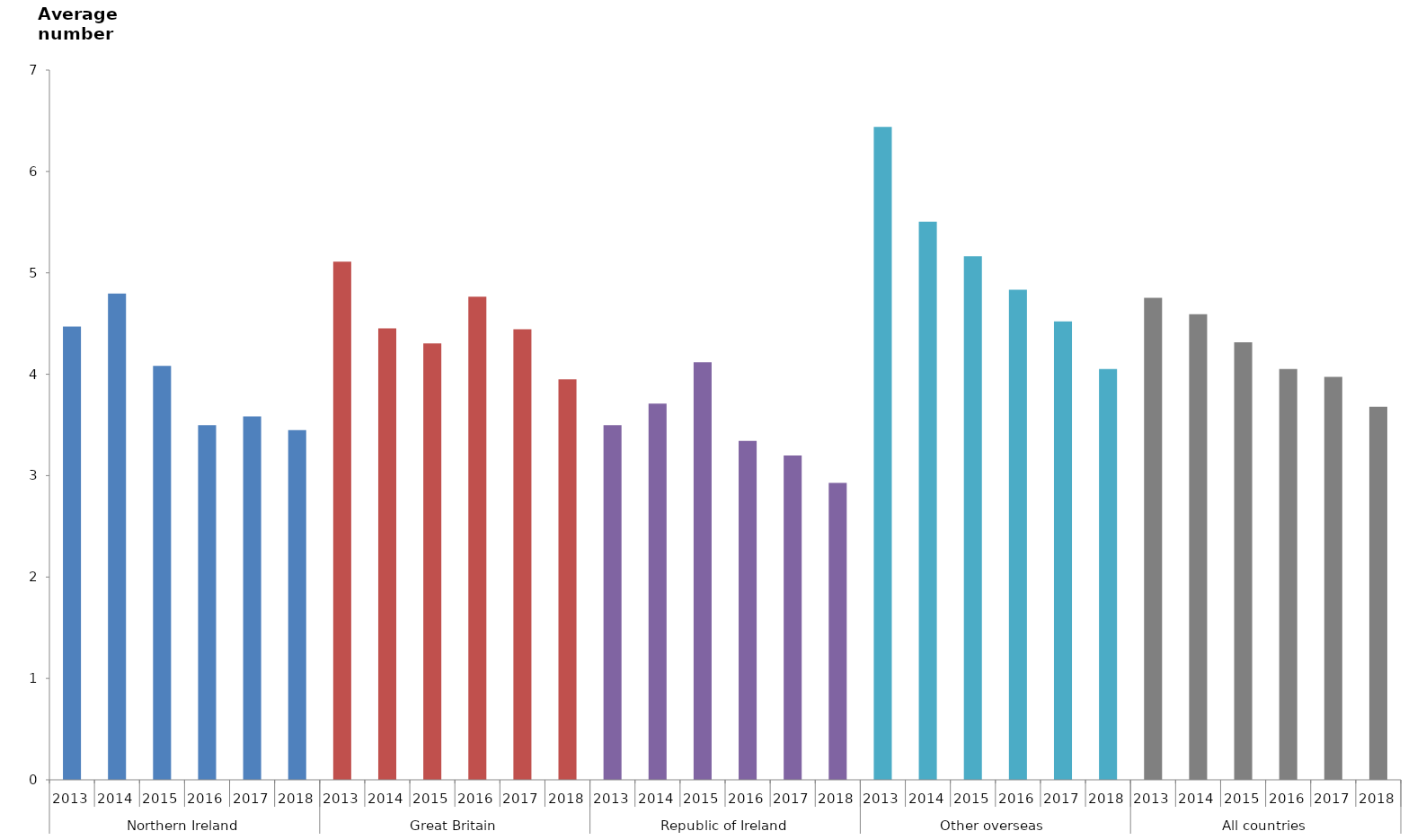
| Category | Nights |
|---|---|
| 0 | 4.47 |
| 1 | 4.796 |
| 2 | 4.082 |
| 3 | 3.497 |
| 4 | 3.584 |
| 5 | 3.448 |
| 6 | 5.11 |
| 7 | 4.452 |
| 8 | 4.304 |
| 9 | 4.764 |
| 10 | 4.444 |
| 11 | 3.949 |
| 12 | 3.498 |
| 13 | 3.711 |
| 14 | 4.117 |
| 15 | 3.342 |
| 16 | 3.199 |
| 17 | 2.927 |
| 18 | 6.439 |
| 19 | 5.505 |
| 20 | 5.163 |
| 21 | 4.833 |
| 22 | 4.52 |
| 23 | 4.053 |
| 24 | 4.754 |
| 25 | 4.592 |
| 26 | 4.316 |
| 27 | 4.051 |
| 28 | 3.975 |
| 29 | 3.68 |